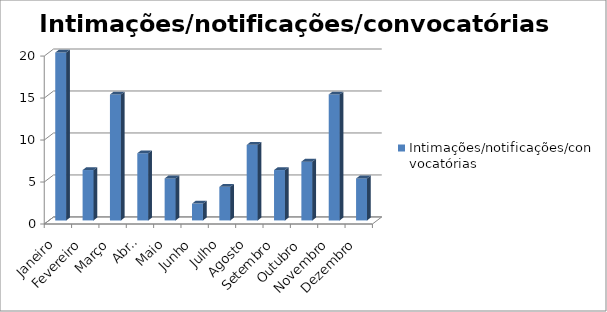
| Category | Intimações/notificações/convocatórias |
|---|---|
| Janeiro | 20 |
| Fevereiro | 6 |
| Março | 15 |
| Abril | 8 |
| Maio | 5 |
| Junho | 2 |
| Julho | 4 |
| Agosto | 9 |
| Setembro | 6 |
| Outubro | 7 |
| Novembro | 15 |
| Dezembro | 5 |